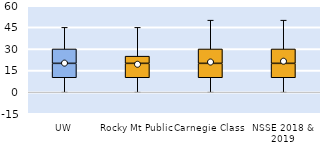
| Category | 25th | 50th | 75th |
|---|---|---|---|
| UW | 10 | 10 | 10 |
| Rocky Mt Public | 10 | 10 | 5 |
| Carnegie Class | 10 | 10 | 10 |
| NSSE 2018 & 2019 | 10 | 10 | 10 |